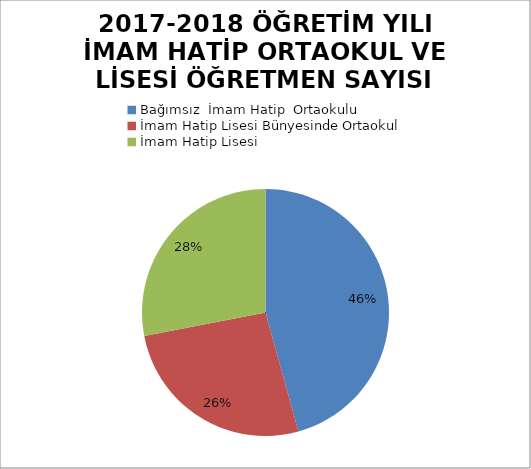
| Category | Series 0 |
|---|---|
| Bağımsız  İmam Hatip  Ortaokulu | 101 |
| İmam Hatip Lisesi Bünyesinde Ortaokul  | 58 |
| İmam Hatip Lisesi | 62 |